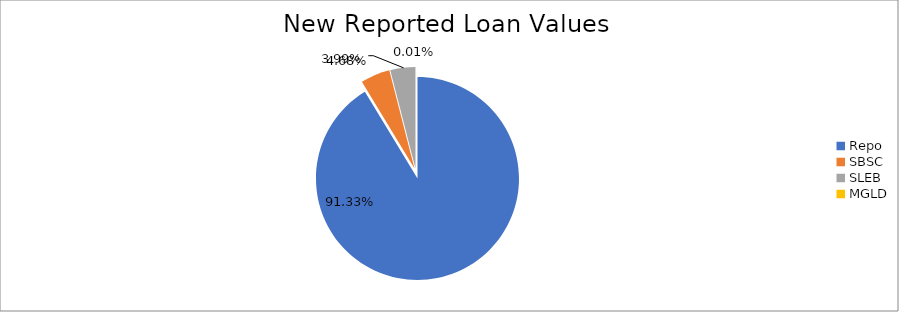
| Category | Series 0 |
|---|---|
| Repo | 11699211.036 |
| SBSC | 598929.627 |
| SLEB | 511380.383 |
| MGLD | 669.213 |